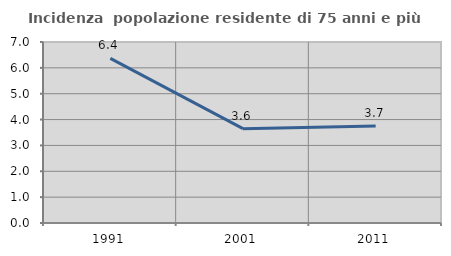
| Category | Incidenza  popolazione residente di 75 anni e più |
|---|---|
| 1991.0 | 6.369 |
| 2001.0 | 3.649 |
| 2011.0 | 3.749 |